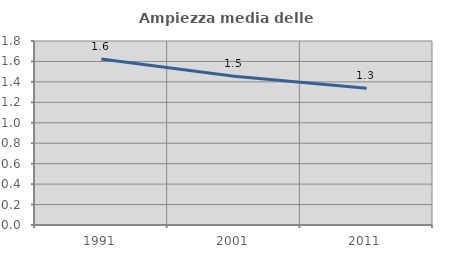
| Category | Ampiezza media delle famiglie |
|---|---|
| 1991.0 | 1.624 |
| 2001.0 | 1.455 |
| 2011.0 | 1.338 |